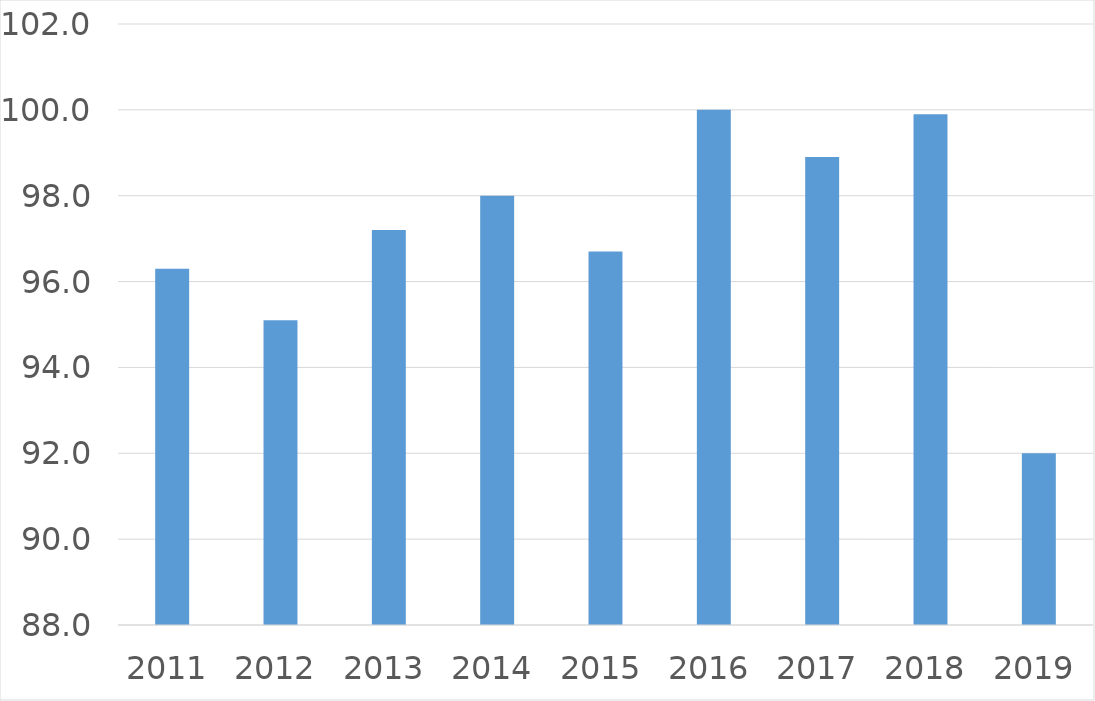
| Category | Series 0 |
|---|---|
| 2011 | 96.3 |
| 2012 | 95.1 |
| 2013 | 97.2 |
| 2014 | 98 |
| 2015 | 96.7 |
| 2016 | 100 |
| 2017 | 98.9 |
| 2018 | 99.9 |
| 2019 | 92 |